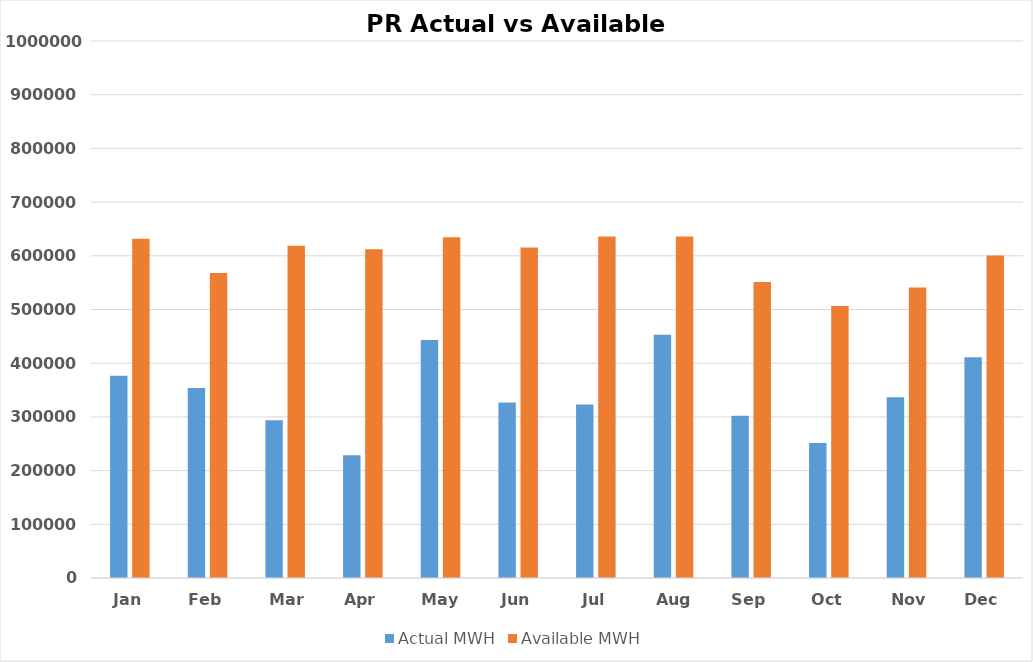
| Category | Actual MWH | Available MWH |
|---|---|---|
| Jan | 376751.2 | 631537.2 |
| Feb | 353872.6 | 567742.8 |
| Mar | 293795 | 618720.75 |
| Apr | 228391.4 | 612037.5 |
| May | 443110.1 | 634736.8 |
| Jun | 326911.8 | 615246.6 |
| Jul | 323022.1 | 636120 |
| Aug | 453088.7 | 636120 |
| Sep | 301940.6 | 551099.75 |
| Oct | 251569.1 | 506483.95 |
| Nov | 336625.2 | 541138.05 |
| Dec | 411048.4 | 600471.25 |